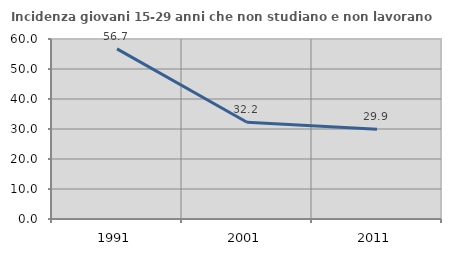
| Category | Incidenza giovani 15-29 anni che non studiano e non lavorano  |
|---|---|
| 1991.0 | 56.723 |
| 2001.0 | 32.231 |
| 2011.0 | 29.897 |